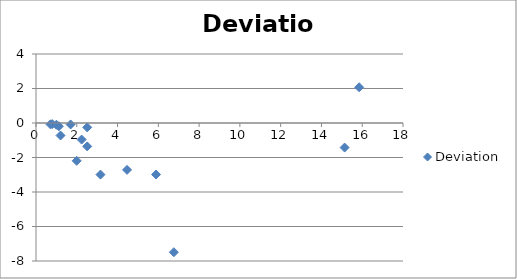
| Category | Deviation |
|---|---|
| 0.7943 | -0.063 |
| 0.7079 | -0.077 |
| 1.0 | -0.101 |
| 1.122 | -0.189 |
| 1.6982 | -0.084 |
| 1.2023 | -0.724 |
| 1.9953 | -2.192 |
| 2.2387 | -0.96 |
| 2.5119 | -0.252 |
| 2.5119 | -1.356 |
| 3.1623 | -2.991 |
| 4.4668 | -2.716 |
| 5.8884 | -2.987 |
| 6.7608 | -7.489 |
| 15.136 | -1.425 |
| 15.85 | 2.072 |